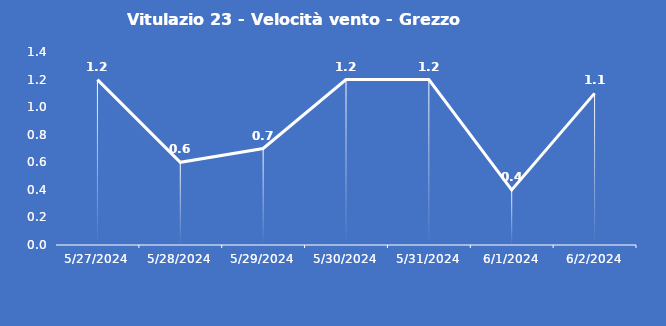
| Category | Vitulazio 23 - Velocità vento - Grezzo (m/s) |
|---|---|
| 5/27/24 | 1.2 |
| 5/28/24 | 0.6 |
| 5/29/24 | 0.7 |
| 5/30/24 | 1.2 |
| 5/31/24 | 1.2 |
| 6/1/24 | 0.4 |
| 6/2/24 | 1.1 |